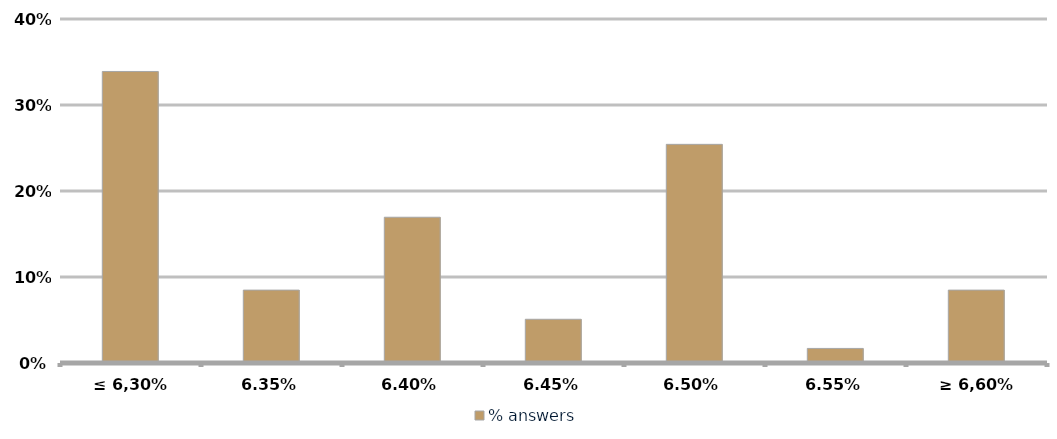
| Category | % answers |
|---|---|
| ≤ 6,30% | 0.339 |
| 6.35% | 0.085 |
| 6.40% | 0.169 |
| 6.45% | 0.051 |
| 6.50% | 0.254 |
| 6.55% | 0.017 |
| ≥ 6,60% | 0.085 |